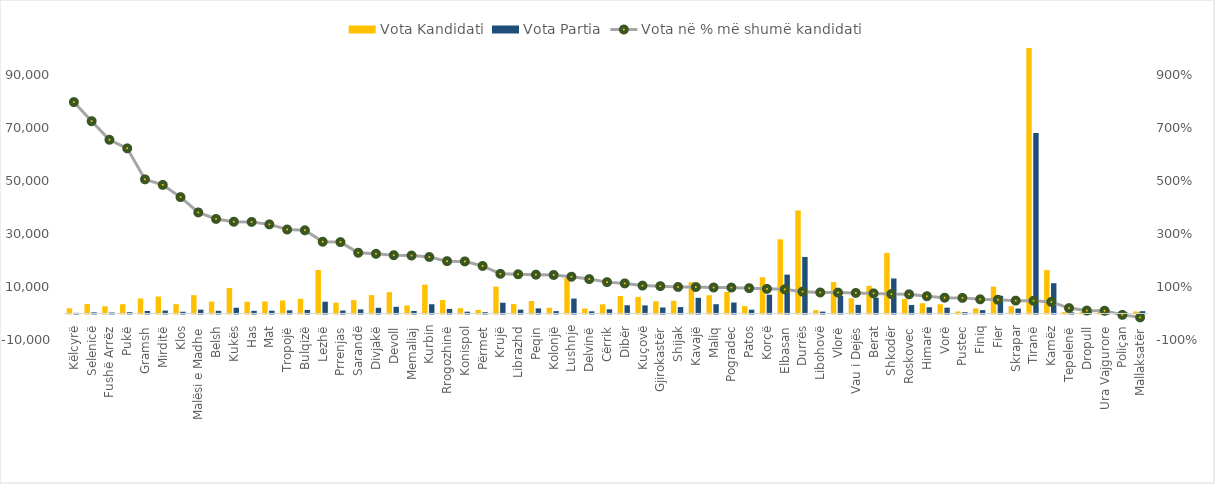
| Category | Vota Kandidati | Vota Partia |
|---|---|---|
| Këlcyrë | 1936 | 216 |
| Selenicë | 3528 | 428 |
| Fushë Arrëz | 2693 | 357 |
| Pukë | 3480 | 482 |
| Gramsh | 5634 | 931 |
| Mirditë | 6357 | 1088 |
| Klos | 3499 | 650 |
| Malësi e Madhe | 6892 | 1434 |
| Belsh | 4497 | 986 |
| Kukës | 9587 | 2152 |
| Has | 4422 | 994 |
| Mat | 4517 | 1037 |
| Tropojë | 4879 | 1172 |
| Bulqizë | 5514 | 1334 |
| Lezhë | 16376 | 4424 |
| Prrenjas | 4046 | 1097 |
| Sarandë | 5019 | 1527 |
| Divjakë | 6920 | 2131 |
| Devoll | 8012 | 2508 |
| Memaliaj | 3017 | 948 |
| Kurbin | 10845 | 3468 |
| Rrogozhinë | 5103 | 1718 |
| Konispol | 1981 | 669 |
| Përmet | 1336 | 479 |
| Krujë | 10102 | 4051 |
| Librazhd | 3557 | 1436 |
| Peqin | 4677 | 1901 |
| Kolonjë | 2153 | 879 |
| Lushnje | 13393 | 5619 |
| Delvinë | 1845 | 804 |
| Cërrik | 3421 | 1569 |
| Dibër | 6577 | 3085 |
| Kuçovë | 6228 | 3039 |
| Gjirokastër | 4600 | 2267 |
| Shijak | 4777 | 2391 |
| Kavajë | 11769 | 5900 |
| Maliq | 6886 | 3482 |
| Pogradec | 8131 | 4116 |
| Patos | 2760 | 1413 |
| Korçë | 13652 | 7087 |
| Elbasan | 27912 | 14621 |
| Durrës | 38784 | 21286 |
| Libohovë | 1248 | 697 |
| Vlorë | 11802 | 6606 |
| Vau i Dejës | 5741 | 3238 |
| Berat | 10412 | 5930 |
| Shkodër | 22804 | 13177 |
| Roskovec | 5458 | 3170 |
| Himarë | 3840 | 2328 |
| Vorë | 3471 | 2178 |
| Pustec | 741 | 467 |
| Finiq | 1913 | 1248 |
| Fier | 10092 | 6651 |
| Skrapar | 2735 | 1844 |
| Tiranë | 100422 | 67999 |
| Kamëz | 16341 | 11391 |
| Tepelenë | 512 | 426 |
| Dropull | 679 | 612 |
| Ura Vajgurore | 1476 | 1340 |
| Poliçan | 461 | 487 |
| Mallaksatër | 736 | 864 |